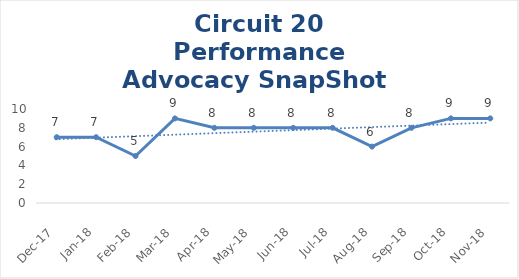
| Category | Circuit 20 |
|---|---|
| Dec-17 | 7 |
| Jan-18 | 7 |
| Feb-18 | 5 |
| Mar-18 | 9 |
| Apr-18 | 8 |
| May-18 | 8 |
| Jun-18 | 8 |
| Jul-18 | 8 |
| Aug-18 | 6 |
| Sep-18 | 8 |
| Oct-18 | 9 |
| Nov-18 | 9 |